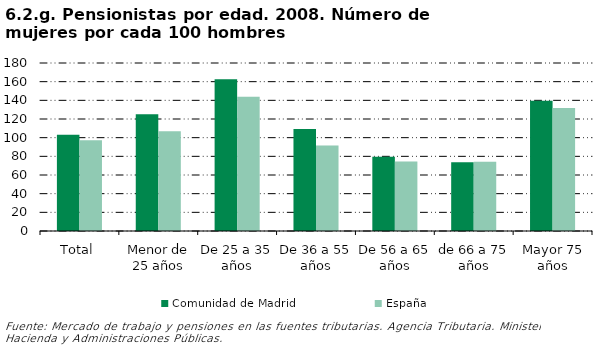
| Category | Comunidad de Madrid | España |
|---|---|---|
| Total | 103.117 | 97.356 |
| Menor de 25 años | 125.153 | 106.802 |
| De 25 a 35 años | 162.66 | 143.88 |
| De 36 a 55 años | 109.391 | 91.704 |
| De 56 a 65 años | 79.639 | 74.589 |
| de 66 a 75 años | 73.584 | 74.178 |
| Mayor 75 años | 139.558 | 131.683 |